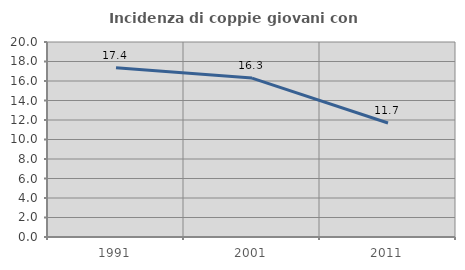
| Category | Incidenza di coppie giovani con figli |
|---|---|
| 1991.0 | 17.367 |
| 2001.0 | 16.296 |
| 2011.0 | 11.692 |